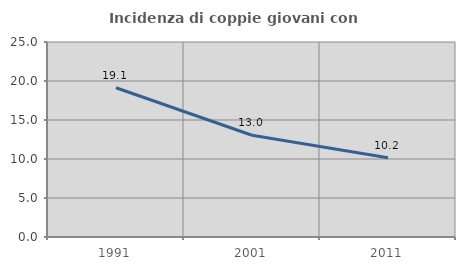
| Category | Incidenza di coppie giovani con figli |
|---|---|
| 1991.0 | 19.139 |
| 2001.0 | 13.045 |
| 2011.0 | 10.162 |